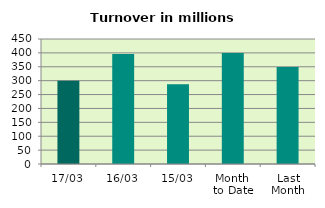
| Category | Series 0 |
|---|---|
| 17/03 | 299.298 |
| 16/03 | 396.293 |
| 15/03 | 287.196 |
| Month 
to Date | 399.325 |
| Last
Month | 349.641 |